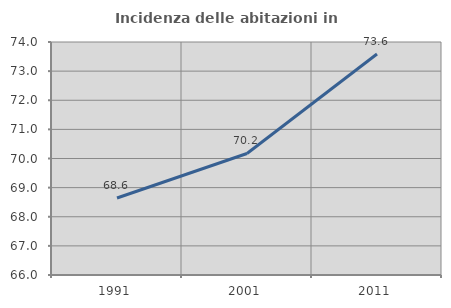
| Category | Incidenza delle abitazioni in proprietà  |
|---|---|
| 1991.0 | 68.645 |
| 2001.0 | 70.173 |
| 2011.0 | 73.588 |